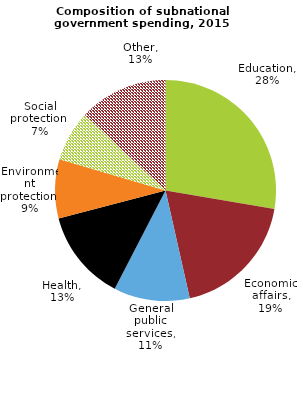
| Category | Series 0 |
|---|---|
| Education | 0.277 |
| Economic affairs | 0.188 |
| General public services | 0.111 |
| Health | 0.133 |
| Environment protection | 0.086 |
| Social protection | 0.074 |
| Other | 0.13 |